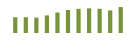
| Category | Saldo [ (1)-(2) ] |
|---|---|
| 0 | 203117.024 |
| 1 | 204244.864 |
| 2 | 198400.412 |
| 3 | 227324.117 |
| 4 | 264760.339 |
| 5 | 296455.186 |
| 6 | 312171.555 |
| 7 | 318321.614 |
| 8 | 312463.312 |
| 9 | 291611.714 |
| 10 | 335033.407 |